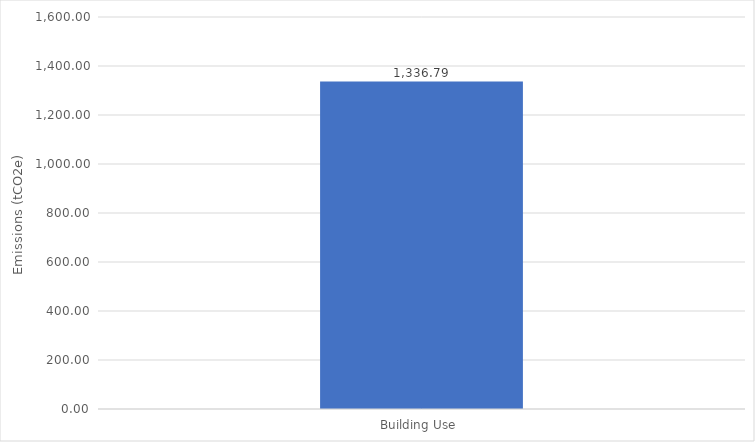
| Category | Emissions
(tCO2e) |
|---|---|
| Building Use  | 1336.79 |